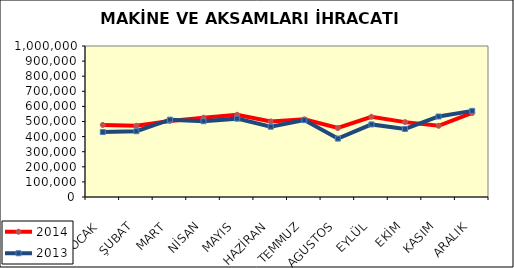
| Category | 2014 | 2013 |
|---|---|---|
| OCAK | 477206.66 | 430048.803 |
| ŞUBAT | 471698.6 | 435630.615 |
| MART | 503717.452 | 512147.934 |
| NİSAN | 525178.23 | 501844.577 |
| MAYIS | 544246.478 | 518926.198 |
| HAZİRAN | 500279.076 | 465383.561 |
| TEMMUZ | 514357.507 | 509307.173 |
| AGUSTOS | 456814.5 | 386713.904 |
| EYLÜL | 531339.715 | 480637.946 |
| EKİM | 495905.704 | 450455.801 |
| KASIM | 471551.033 | 533237.612 |
| ARALIK | 556414.829 | 570357.508 |